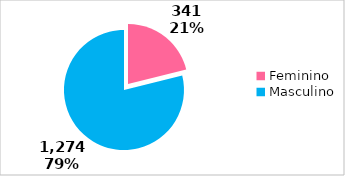
| Category | Qtde |
|---|---|
| Feminino | 341 |
| Masculino | 1274 |